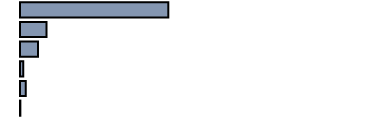
| Category | 43,3 |
|---|---|
| 0 | 41.543 |
| 1 | 7.405 |
| 2 | 5.065 |
| 3 | 0.903 |
| 4 | 1.644 |
| 5 | 0.098 |